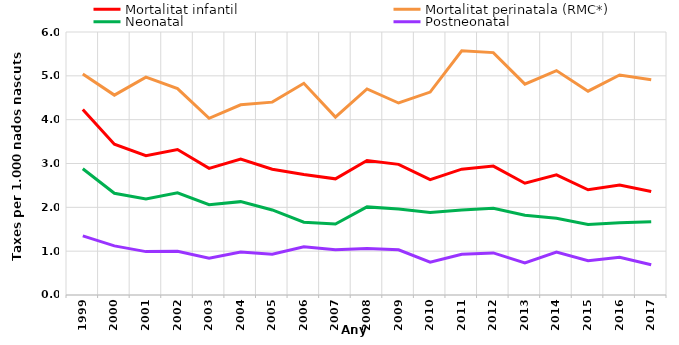
| Category | Mortalitat infantil | Mortalitat perinatala (RMC*) | Neonatal | Postneonatal |
|---|---|---|---|---|
| 1999.0 | 4.23 | 5.04 | 2.88 | 1.35 |
| 2000.0 | 3.44 | 4.56 | 2.32 | 1.12 |
| 2001.0 | 3.18 | 4.97 | 2.19 | 0.99 |
| 2002.0 | 3.32 | 4.71 | 2.33 | 1 |
| 2003.0 | 2.89 | 4.03 | 2.06 | 0.84 |
| 2004.0 | 3.1 | 4.34 | 2.13 | 0.98 |
| 2005.0 | 2.87 | 4.4 | 1.94 | 0.93 |
| 2006.0 | 2.75 | 4.83 | 1.66 | 1.1 |
| 2007.0 | 2.65 | 4.06 | 1.62 | 1.03 |
| 2008.0 | 3.07 | 4.7 | 2.01 | 1.06 |
| 2009.0 | 2.98 | 4.38 | 1.96 | 1.03 |
| 2010.0 | 2.63 | 4.63 | 1.88 | 0.75 |
| 2011.0 | 2.87 | 5.57 | 1.94 | 0.93 |
| 2012.0 | 2.94 | 5.53 | 1.98 | 0.96 |
| 2013.0 | 2.55 | 4.81 | 1.82 | 0.73 |
| 2014.0 | 2.74 | 5.12 | 1.75 | 0.98 |
| 2015.0 | 2.4 | 4.65 | 1.61 | 0.78 |
| 2016.0 | 2.51 | 5.02 | 1.65 | 0.86 |
| 2017.0 | 2.36 | 4.91 | 1.67 | 0.69 |